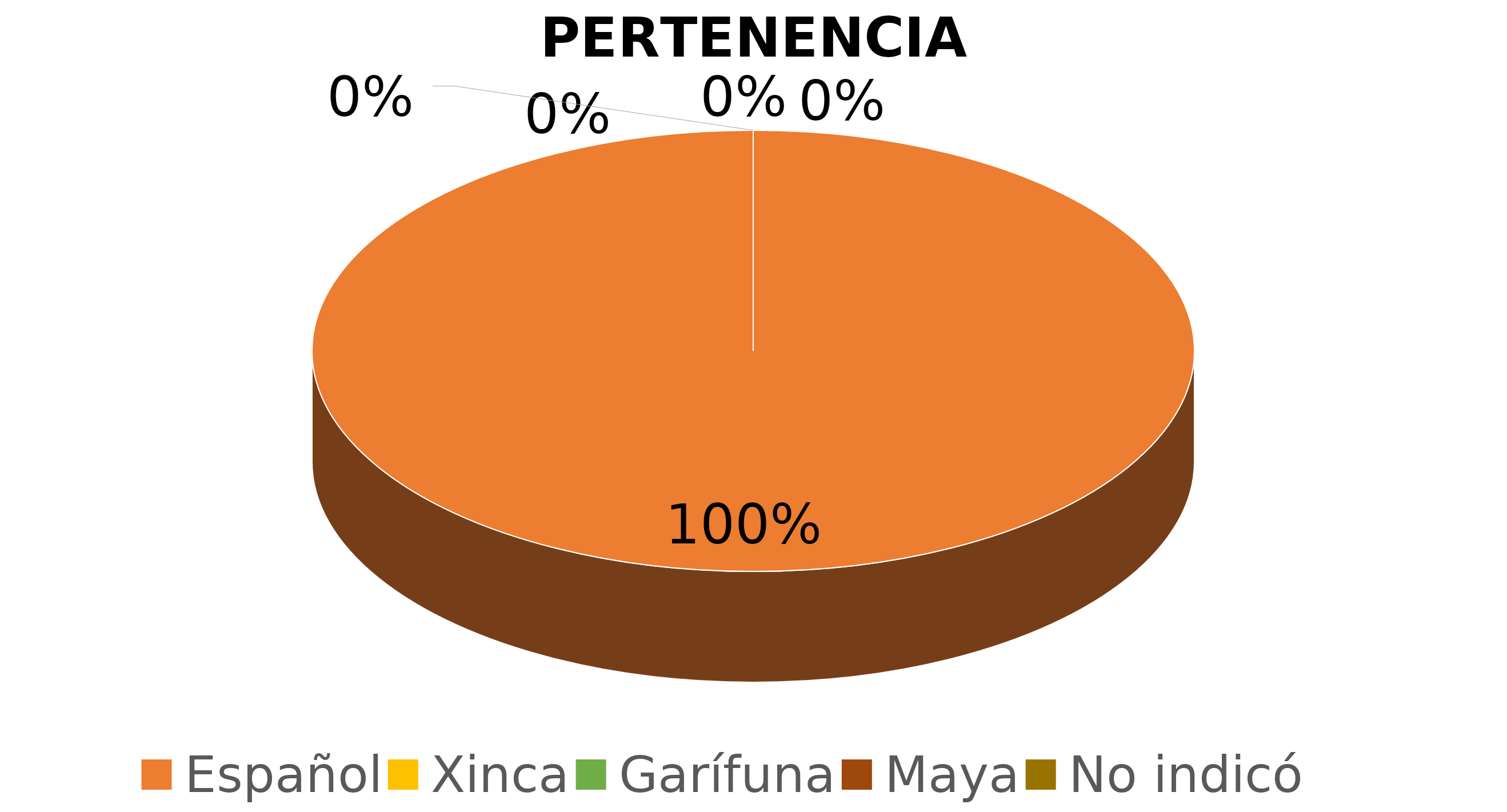
| Category | Series 0 |
|---|---|
| Español | 1 |
| Xinca | 0 |
| Garífuna | 0 |
| Maya | 0 |
| No indicó | 0 |